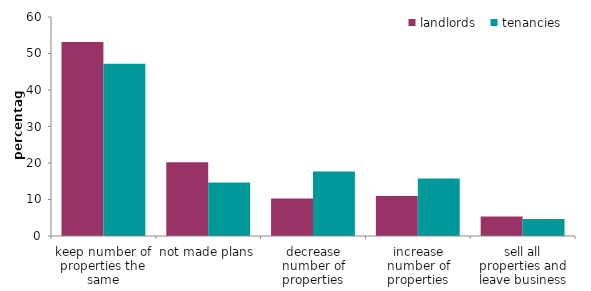
| Category | landlords | tenancies |
|---|---|---|
| keep number of properties the same | 53.151 | 47.225 |
| not made plans | 20.221 | 14.66 |
| decrease number of properties | 10.264 | 17.683 |
| increase number of properties | 10.991 | 15.777 |
| sell all properties and leave business | 5.373 | 4.655 |